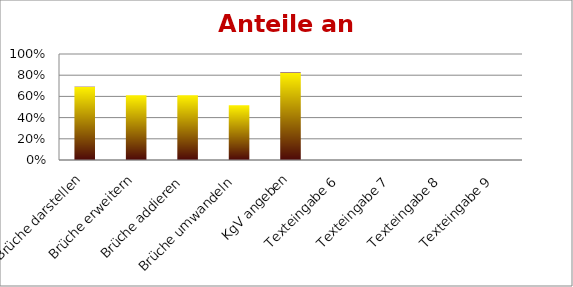
| Category | Series 0 |
|---|---|
| Brüche darstellen | 0.69 |
| Brüche erweitern | 0.611 |
| Brüche addieren | 0.611 |
| Brüche umwandeln | 0.516 |
| KgV angeben | 0.825 |
| Texteingabe 6 | 0 |
| Texteingabe 7 | 0 |
| Texteingabe 8 | 0 |
| Texteingabe 9 | 0 |